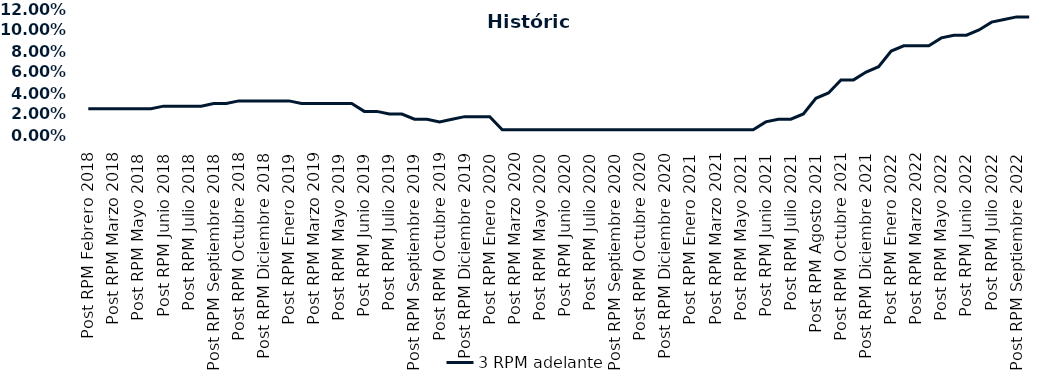
| Category | 3 RPM adelante |
|---|---|
| Post RPM Febrero 2018 | 0.025 |
| Pre RPM Marzo 2018 | 0.025 |
| Post RPM Marzo 2018 | 0.025 |
| Pre RPM Mayo 2018 | 0.025 |
| Post RPM Mayo 2018 | 0.025 |
| Pre RPM Junio 2018 | 0.025 |
| Post RPM Junio 2018 | 0.028 |
| Pre RPM Julio 2018 | 0.028 |
| Post RPM Julio 2018 | 0.028 |
| Pre RPM Septiembre 2018 | 0.028 |
| Post RPM Septiembre 2018 | 0.03 |
| Pre RPM Octubre 2018 | 0.03 |
| Post RPM Octubre 2018 | 0.032 |
| Pre RPM Diciembre 2018 | 0.032 |
| Post RPM Diciembre 2018 | 0.032 |
| Pre RPM Enero 2019 | 0.032 |
| Post RPM Enero 2019 | 0.032 |
| Pre RPM Marzo 2019 | 0.03 |
| Post RPM Marzo 2019 | 0.03 |
| Pre RPM Mayo 2019 | 0.03 |
| Post RPM Mayo 2019 | 0.03 |
| Pre RPM Junio 2019 | 0.03 |
| Post RPM Junio 2019 | 0.022 |
| Pre RPM Julio 2019 | 0.022 |
| Post RPM Julio 2019 | 0.02 |
| Pre RPM Septiembre 2019 | 0.02 |
| Post RPM Septiembre 2019 | 0.015 |
| Pre RPM Octubre 2019 | 0.015 |
| Post RPM Octubre 2019 | 0.012 |
| Pre RPM Diciembre 2019 | 0.015 |
| Post RPM Diciembre 2019 | 0.018 |
| Pre RPM Enero 2020 | 0.018 |
| Post RPM Enero 2020 | 0.018 |
| Pre RPM Marzo 2020 | 0.005 |
| Post RPM Marzo 2020 | 0.005 |
| Pre RPM Mayo 2020 | 0.005 |
| Post RPM Mayo 2020 | 0.005 |
| Pre RPM Junio 2020 | 0.005 |
| Post RPM Junio 2020 | 0.005 |
| Pre RPM Julio 2020 | 0.005 |
| Post RPM Julio 2020 | 0.005 |
| Pre RPM Septiembre 2020 | 0.005 |
| Post RPM Septiembre 2020 | 0.005 |
| Pre RPM Octubre 2020 | 0.005 |
| Post RPM Octubre 2020 | 0.005 |
| Pre RPM Diciembre 2020 | 0.005 |
| Post RPM Diciembre 2020 | 0.005 |
| Pre RPM Enero 2021 | 0.005 |
| Post RPM Enero 2021 | 0.005 |
| Pre RPM Marzo 2021 | 0.005 |
| Post RPM Marzo 2021 | 0.005 |
| Pre RPM Mayo 2021 | 0.005 |
| Post RPM Mayo 2021 | 0.005 |
| Pre RPM Junio 2021 | 0.005 |
| Post RPM Junio 2021 | 0.012 |
| Pre RPM Julio 2021 | 0.015 |
| Post RPM Julio 2021 | 0.015 |
| Pre RPM Agosto 2021 | 0.02 |
| Post RPM Agosto 2021 | 0.035 |
| Pre RPM Octubre 2021 | 0.04 |
| Post RPM Octubre 2021 | 0.052 |
| Pre RPM Diciembre 2021 | 0.052 |
| Post RPM Diciembre 2021 | 0.06 |
| Pre RPM Enero 2022 | 0.065 |
| Post RPM Enero 2022 | 0.08 |
| Pre RPM Marzo 2022 | 0.085 |
| Post RPM Marzo 2022 | 0.085 |
| Pre RPM Mayo 2022 | 0.085 |
| Post RPM Mayo 2022 | 0.092 |
| Pre RPM Junio 2022 | 0.095 |
| Post RPM Junio 2022 | 0.095 |
| Pre RPM Julio 2022 | 0.1 |
| Post RPM Julio 2022 | 0.108 |
| Pre RPM Septiembre 2022 | 0.11 |
| Post RPM Septiembre 2022 | 0.112 |
| Pre RPM Octubre 2022 | 0.112 |